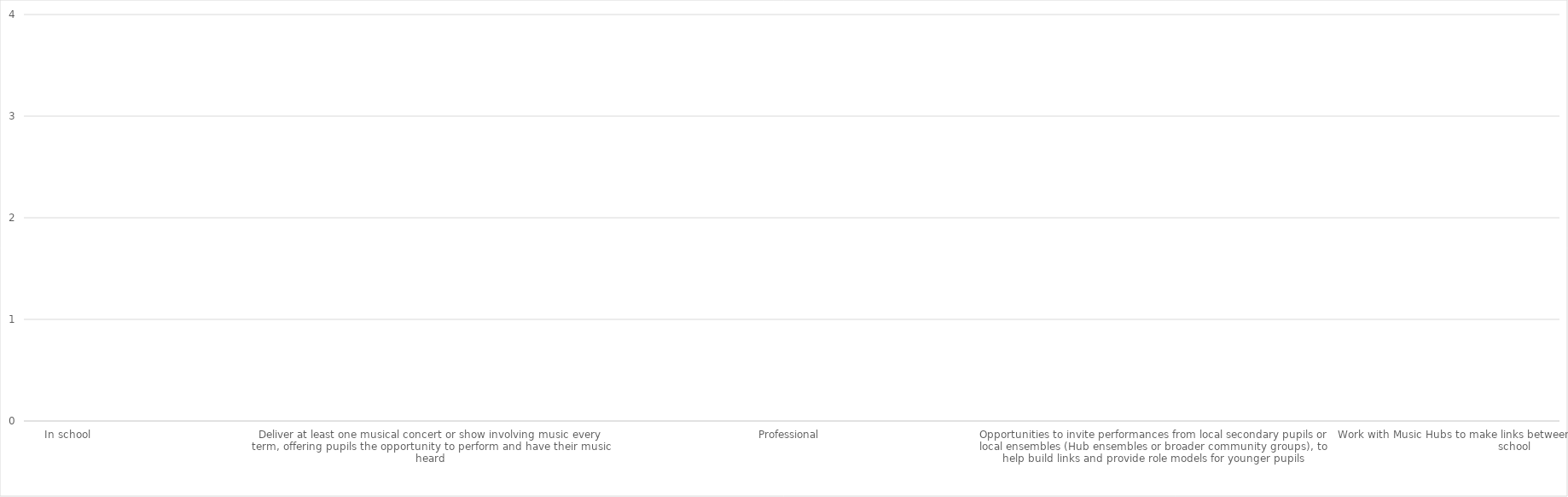
| Category | Series 0 |
|---|---|
| In school | 0 |
| Peer to peer | 0 |
| To parents or carers (in concerts, assemblies, shows)  | 0 |
| Beyond school wherever possible | 0 |
| Deliver at least one musical concert or show involving music every term, offering pupils the opportunity to perform and have their music heard | 0 |
| Considering mitigations to reduce the time missed | 0 |
| Large-scale performances  | 0 |
| Smaller-scale workshops | 0 |
| Professional | 0 |
| Amateur | 0 |
| Within school  | 0 |
| Between school | 0 |
| Opportunities to invite performances from local secondary pupils or local ensembles (Hub ensembles or broader community groups), to help build links and provide role models for younger pupils | 0 |
| Live music opportunities link into curriculum delivery, build on the pupils’ learning | 0 |
| Live music opportunities reflect and build on pupils’ own musical interests and passions | 0 |
| Sought support from professional music organisations in area, as well as national organisations with online and outreach programmes, such as national orchestras and the Royal Opera House, whose online learning platform hosts free creative learning content  | 0 |
| Work with Music Hubs to make links between such organisations and school | 0 |